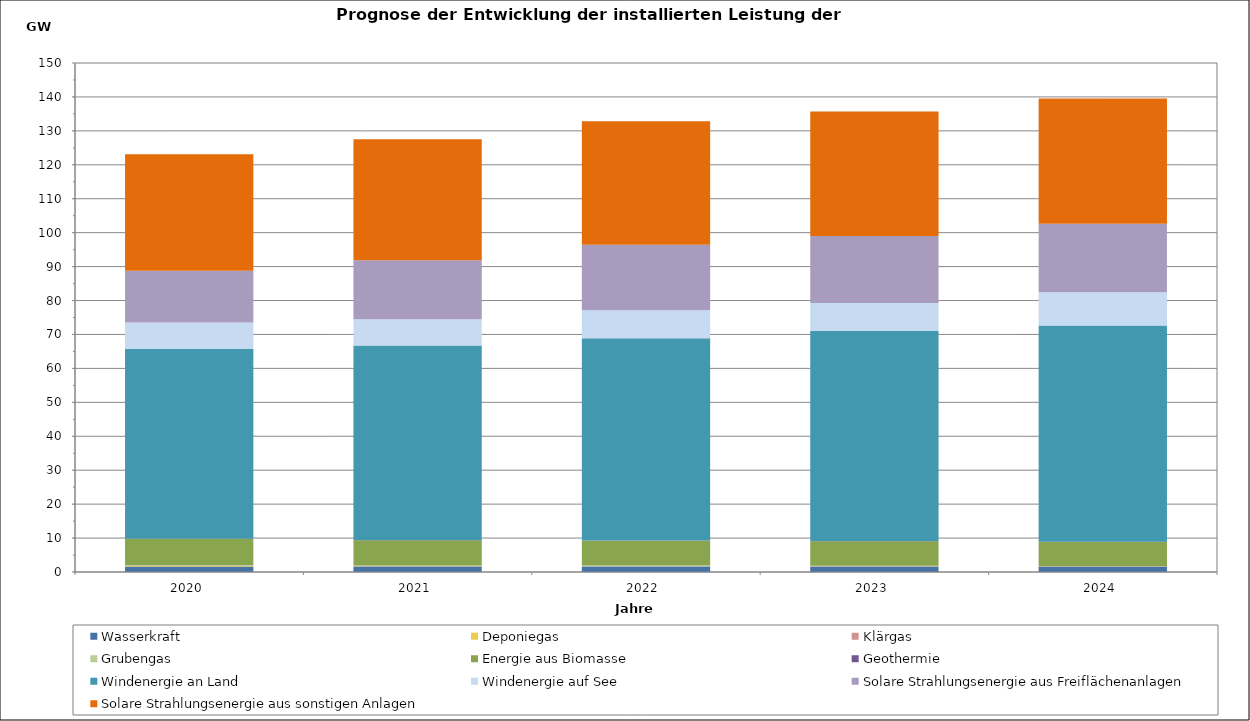
| Category | Wasserkraft | Deponiegas | Klärgas | Grubengas | Energie aus Biomasse | Geothermie | Windenergie an Land | Windenergie auf See | Solare Strahlungsenergie aus Freiflächenanlagen | Solare Strahlungsenergie aus sonstigen Anlagen |
|---|---|---|---|---|---|---|---|---|---|---|
| 2020.0 | 1584.872 | 151.487 | 72.12 | 203.959 | 7777.198 | 42.662 | 55952.207 | 7717.808 | 15285.759 | 34303.489 |
| 2021.0 | 1594.542 | 68.715 | 72.573 | 170.622 | 7448.113 | 42.662 | 57351.575 | 7717.808 | 17417.819 | 35664.489 |
| 2022.0 | 1604.212 | 49.632 | 73.025 | 156.608 | 7322.918 | 47.162 | 59624.53 | 8289.808 | 19280.383 | 36382.705 |
| 2023.0 | 1613.882 | 46.127 | 73.477 | 100.362 | 7219.286 | 51.662 | 61896.058 | 8289.808 | 19748.757 | 36648.665 |
| 2024.0 | 1623.552 | 38.373 | 73.929 | 46.656 | 7085.378 | 51.662 | 63724.794 | 9785.808 | 20223.139 | 36914.626 |